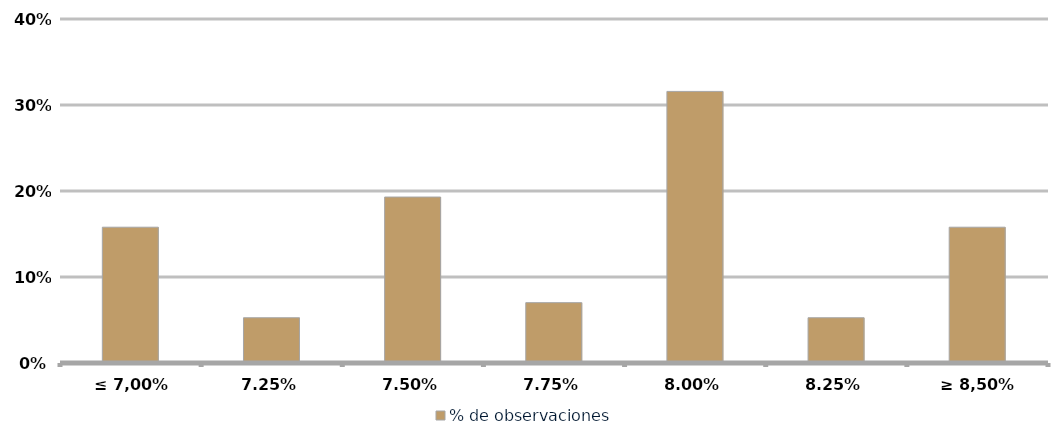
| Category | % de observaciones  |
|---|---|
| ≤ 7,00% | 0.158 |
| 7,25% | 0.053 |
| 7,50% | 0.193 |
| 7,75% | 0.07 |
| 8,00% | 0.316 |
| 8,25% | 0.053 |
| ≥ 8,50% | 0.158 |